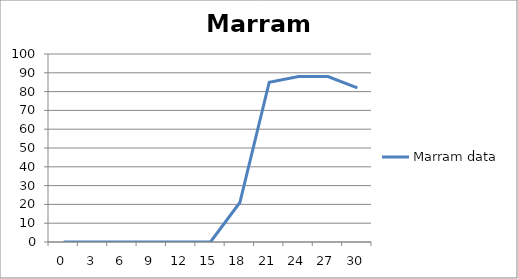
| Category | Marram data |
|---|---|
| 0.0 | 0 |
| 3.0 | 0 |
| 6.0 | 0 |
| 9.0 | 0 |
| 12.0 | 0 |
| 15.0 | 0 |
| 18.0 | 21 |
| 21.0 | 85 |
| 24.0 | 88 |
| 27.0 | 88 |
| 30.0 | 82 |